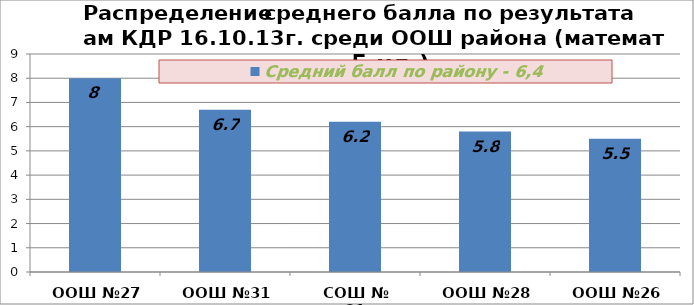
| Category | Средний балл по району - 6,4 |
|---|---|
| ООШ №27 | 8 |
| ООШ №31 | 6.7 |
| СОШ № 21 | 6.2 |
| ООШ №28 | 5.8 |
| ООШ №26 | 5.5 |